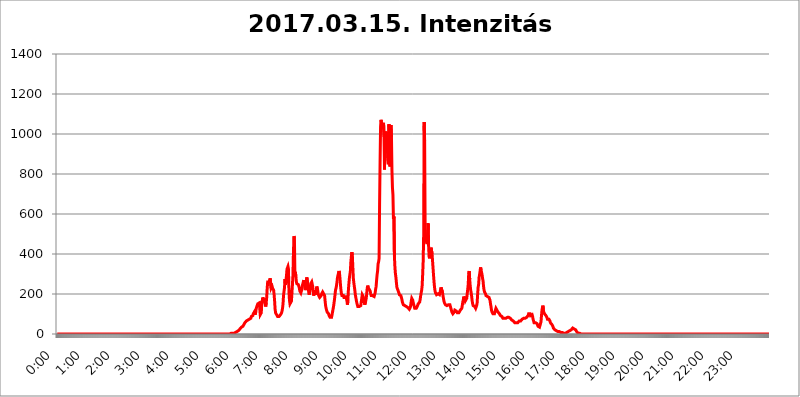
| Category | 2017.03.15. Intenzitás [W/m^2] |
|---|---|
| 0.0 | 0 |
| 0.0006944444444444445 | 0 |
| 0.001388888888888889 | 0 |
| 0.0020833333333333333 | 0 |
| 0.002777777777777778 | 0 |
| 0.003472222222222222 | 0 |
| 0.004166666666666667 | 0 |
| 0.004861111111111111 | 0 |
| 0.005555555555555556 | 0 |
| 0.0062499999999999995 | 0 |
| 0.006944444444444444 | 0 |
| 0.007638888888888889 | 0 |
| 0.008333333333333333 | 0 |
| 0.009027777777777779 | 0 |
| 0.009722222222222222 | 0 |
| 0.010416666666666666 | 0 |
| 0.011111111111111112 | 0 |
| 0.011805555555555555 | 0 |
| 0.012499999999999999 | 0 |
| 0.013194444444444444 | 0 |
| 0.013888888888888888 | 0 |
| 0.014583333333333332 | 0 |
| 0.015277777777777777 | 0 |
| 0.015972222222222224 | 0 |
| 0.016666666666666666 | 0 |
| 0.017361111111111112 | 0 |
| 0.018055555555555557 | 0 |
| 0.01875 | 0 |
| 0.019444444444444445 | 0 |
| 0.02013888888888889 | 0 |
| 0.020833333333333332 | 0 |
| 0.02152777777777778 | 0 |
| 0.022222222222222223 | 0 |
| 0.02291666666666667 | 0 |
| 0.02361111111111111 | 0 |
| 0.024305555555555556 | 0 |
| 0.024999999999999998 | 0 |
| 0.025694444444444447 | 0 |
| 0.02638888888888889 | 0 |
| 0.027083333333333334 | 0 |
| 0.027777777777777776 | 0 |
| 0.02847222222222222 | 0 |
| 0.029166666666666664 | 0 |
| 0.029861111111111113 | 0 |
| 0.030555555555555555 | 0 |
| 0.03125 | 0 |
| 0.03194444444444445 | 0 |
| 0.03263888888888889 | 0 |
| 0.03333333333333333 | 0 |
| 0.034027777777777775 | 0 |
| 0.034722222222222224 | 0 |
| 0.035416666666666666 | 0 |
| 0.036111111111111115 | 0 |
| 0.03680555555555556 | 0 |
| 0.0375 | 0 |
| 0.03819444444444444 | 0 |
| 0.03888888888888889 | 0 |
| 0.03958333333333333 | 0 |
| 0.04027777777777778 | 0 |
| 0.04097222222222222 | 0 |
| 0.041666666666666664 | 0 |
| 0.042361111111111106 | 0 |
| 0.04305555555555556 | 0 |
| 0.043750000000000004 | 0 |
| 0.044444444444444446 | 0 |
| 0.04513888888888889 | 0 |
| 0.04583333333333334 | 0 |
| 0.04652777777777778 | 0 |
| 0.04722222222222222 | 0 |
| 0.04791666666666666 | 0 |
| 0.04861111111111111 | 0 |
| 0.049305555555555554 | 0 |
| 0.049999999999999996 | 0 |
| 0.05069444444444445 | 0 |
| 0.051388888888888894 | 0 |
| 0.052083333333333336 | 0 |
| 0.05277777777777778 | 0 |
| 0.05347222222222222 | 0 |
| 0.05416666666666667 | 0 |
| 0.05486111111111111 | 0 |
| 0.05555555555555555 | 0 |
| 0.05625 | 0 |
| 0.05694444444444444 | 0 |
| 0.057638888888888885 | 0 |
| 0.05833333333333333 | 0 |
| 0.05902777777777778 | 0 |
| 0.059722222222222225 | 0 |
| 0.06041666666666667 | 0 |
| 0.061111111111111116 | 0 |
| 0.06180555555555556 | 0 |
| 0.0625 | 0 |
| 0.06319444444444444 | 0 |
| 0.06388888888888888 | 0 |
| 0.06458333333333334 | 0 |
| 0.06527777777777778 | 0 |
| 0.06597222222222222 | 0 |
| 0.06666666666666667 | 0 |
| 0.06736111111111111 | 0 |
| 0.06805555555555555 | 0 |
| 0.06874999999999999 | 0 |
| 0.06944444444444443 | 0 |
| 0.07013888888888889 | 0 |
| 0.07083333333333333 | 0 |
| 0.07152777777777779 | 0 |
| 0.07222222222222223 | 0 |
| 0.07291666666666667 | 0 |
| 0.07361111111111111 | 0 |
| 0.07430555555555556 | 0 |
| 0.075 | 0 |
| 0.07569444444444444 | 0 |
| 0.0763888888888889 | 0 |
| 0.07708333333333334 | 0 |
| 0.07777777777777778 | 0 |
| 0.07847222222222222 | 0 |
| 0.07916666666666666 | 0 |
| 0.0798611111111111 | 0 |
| 0.08055555555555556 | 0 |
| 0.08125 | 0 |
| 0.08194444444444444 | 0 |
| 0.08263888888888889 | 0 |
| 0.08333333333333333 | 0 |
| 0.08402777777777777 | 0 |
| 0.08472222222222221 | 0 |
| 0.08541666666666665 | 0 |
| 0.08611111111111112 | 0 |
| 0.08680555555555557 | 0 |
| 0.08750000000000001 | 0 |
| 0.08819444444444445 | 0 |
| 0.08888888888888889 | 0 |
| 0.08958333333333333 | 0 |
| 0.09027777777777778 | 0 |
| 0.09097222222222222 | 0 |
| 0.09166666666666667 | 0 |
| 0.09236111111111112 | 0 |
| 0.09305555555555556 | 0 |
| 0.09375 | 0 |
| 0.09444444444444444 | 0 |
| 0.09513888888888888 | 0 |
| 0.09583333333333333 | 0 |
| 0.09652777777777777 | 0 |
| 0.09722222222222222 | 0 |
| 0.09791666666666667 | 0 |
| 0.09861111111111111 | 0 |
| 0.09930555555555555 | 0 |
| 0.09999999999999999 | 0 |
| 0.10069444444444443 | 0 |
| 0.1013888888888889 | 0 |
| 0.10208333333333335 | 0 |
| 0.10277777777777779 | 0 |
| 0.10347222222222223 | 0 |
| 0.10416666666666667 | 0 |
| 0.10486111111111111 | 0 |
| 0.10555555555555556 | 0 |
| 0.10625 | 0 |
| 0.10694444444444444 | 0 |
| 0.1076388888888889 | 0 |
| 0.10833333333333334 | 0 |
| 0.10902777777777778 | 0 |
| 0.10972222222222222 | 0 |
| 0.1111111111111111 | 0 |
| 0.11180555555555556 | 0 |
| 0.11180555555555556 | 0 |
| 0.1125 | 0 |
| 0.11319444444444444 | 0 |
| 0.11388888888888889 | 0 |
| 0.11458333333333333 | 0 |
| 0.11527777777777777 | 0 |
| 0.11597222222222221 | 0 |
| 0.11666666666666665 | 0 |
| 0.1173611111111111 | 0 |
| 0.11805555555555557 | 0 |
| 0.11944444444444445 | 0 |
| 0.12013888888888889 | 0 |
| 0.12083333333333333 | 0 |
| 0.12152777777777778 | 0 |
| 0.12222222222222223 | 0 |
| 0.12291666666666667 | 0 |
| 0.12291666666666667 | 0 |
| 0.12361111111111112 | 0 |
| 0.12430555555555556 | 0 |
| 0.125 | 0 |
| 0.12569444444444444 | 0 |
| 0.12638888888888888 | 0 |
| 0.12708333333333333 | 0 |
| 0.16875 | 0 |
| 0.12847222222222224 | 0 |
| 0.12916666666666668 | 0 |
| 0.12986111111111112 | 0 |
| 0.13055555555555556 | 0 |
| 0.13125 | 0 |
| 0.13194444444444445 | 0 |
| 0.1326388888888889 | 0 |
| 0.13333333333333333 | 0 |
| 0.13402777777777777 | 0 |
| 0.13402777777777777 | 0 |
| 0.13472222222222222 | 0 |
| 0.13541666666666666 | 0 |
| 0.1361111111111111 | 0 |
| 0.13749999999999998 | 0 |
| 0.13819444444444443 | 0 |
| 0.1388888888888889 | 0 |
| 0.13958333333333334 | 0 |
| 0.14027777777777778 | 0 |
| 0.14097222222222222 | 0 |
| 0.14166666666666666 | 0 |
| 0.1423611111111111 | 0 |
| 0.14305555555555557 | 0 |
| 0.14375000000000002 | 0 |
| 0.14444444444444446 | 0 |
| 0.1451388888888889 | 0 |
| 0.1451388888888889 | 0 |
| 0.14652777777777778 | 0 |
| 0.14722222222222223 | 0 |
| 0.14791666666666667 | 0 |
| 0.1486111111111111 | 0 |
| 0.14930555555555555 | 0 |
| 0.15 | 0 |
| 0.15069444444444444 | 0 |
| 0.15138888888888888 | 0 |
| 0.15208333333333332 | 0 |
| 0.15277777777777776 | 0 |
| 0.15347222222222223 | 0 |
| 0.15416666666666667 | 0 |
| 0.15486111111111112 | 0 |
| 0.15555555555555556 | 0 |
| 0.15625 | 0 |
| 0.15694444444444444 | 0 |
| 0.15763888888888888 | 0 |
| 0.15833333333333333 | 0 |
| 0.15902777777777777 | 0 |
| 0.15972222222222224 | 0 |
| 0.16041666666666668 | 0 |
| 0.16111111111111112 | 0 |
| 0.16180555555555556 | 0 |
| 0.1625 | 0 |
| 0.16319444444444445 | 0 |
| 0.1638888888888889 | 0 |
| 0.16458333333333333 | 0 |
| 0.16527777777777777 | 0 |
| 0.16597222222222222 | 0 |
| 0.16666666666666666 | 0 |
| 0.1673611111111111 | 0 |
| 0.16805555555555554 | 0 |
| 0.16874999999999998 | 0 |
| 0.16944444444444443 | 0 |
| 0.17013888888888887 | 0 |
| 0.1708333333333333 | 0 |
| 0.17152777777777775 | 0 |
| 0.17222222222222225 | 0 |
| 0.1729166666666667 | 0 |
| 0.17361111111111113 | 0 |
| 0.17430555555555557 | 0 |
| 0.17500000000000002 | 0 |
| 0.17569444444444446 | 0 |
| 0.1763888888888889 | 0 |
| 0.17708333333333334 | 0 |
| 0.17777777777777778 | 0 |
| 0.17847222222222223 | 0 |
| 0.17916666666666667 | 0 |
| 0.1798611111111111 | 0 |
| 0.18055555555555555 | 0 |
| 0.18125 | 0 |
| 0.18194444444444444 | 0 |
| 0.1826388888888889 | 0 |
| 0.18333333333333335 | 0 |
| 0.1840277777777778 | 0 |
| 0.18472222222222223 | 0 |
| 0.18541666666666667 | 0 |
| 0.18611111111111112 | 0 |
| 0.18680555555555556 | 0 |
| 0.1875 | 0 |
| 0.18819444444444444 | 0 |
| 0.18888888888888888 | 0 |
| 0.18958333333333333 | 0 |
| 0.19027777777777777 | 0 |
| 0.1909722222222222 | 0 |
| 0.19166666666666665 | 0 |
| 0.19236111111111112 | 0 |
| 0.19305555555555554 | 0 |
| 0.19375 | 0 |
| 0.19444444444444445 | 0 |
| 0.1951388888888889 | 0 |
| 0.19583333333333333 | 0 |
| 0.19652777777777777 | 0 |
| 0.19722222222222222 | 0 |
| 0.19791666666666666 | 0 |
| 0.1986111111111111 | 0 |
| 0.19930555555555554 | 0 |
| 0.19999999999999998 | 0 |
| 0.20069444444444443 | 0 |
| 0.20138888888888887 | 0 |
| 0.2020833333333333 | 0 |
| 0.2027777777777778 | 0 |
| 0.2034722222222222 | 0 |
| 0.2041666666666667 | 0 |
| 0.20486111111111113 | 0 |
| 0.20555555555555557 | 0 |
| 0.20625000000000002 | 0 |
| 0.20694444444444446 | 0 |
| 0.2076388888888889 | 0 |
| 0.20833333333333334 | 0 |
| 0.20902777777777778 | 0 |
| 0.20972222222222223 | 0 |
| 0.21041666666666667 | 0 |
| 0.2111111111111111 | 0 |
| 0.21180555555555555 | 0 |
| 0.2125 | 0 |
| 0.21319444444444444 | 0 |
| 0.2138888888888889 | 0 |
| 0.21458333333333335 | 0 |
| 0.2152777777777778 | 0 |
| 0.21597222222222223 | 0 |
| 0.21666666666666667 | 0 |
| 0.21736111111111112 | 0 |
| 0.21805555555555556 | 0 |
| 0.21875 | 0 |
| 0.21944444444444444 | 0 |
| 0.22013888888888888 | 0 |
| 0.22083333333333333 | 0 |
| 0.22152777777777777 | 0 |
| 0.2222222222222222 | 0 |
| 0.22291666666666665 | 0 |
| 0.2236111111111111 | 0 |
| 0.22430555555555556 | 0 |
| 0.225 | 0 |
| 0.22569444444444445 | 0 |
| 0.2263888888888889 | 0 |
| 0.22708333333333333 | 0 |
| 0.22777777777777777 | 0 |
| 0.22847222222222222 | 0 |
| 0.22916666666666666 | 0 |
| 0.2298611111111111 | 0 |
| 0.23055555555555554 | 0 |
| 0.23124999999999998 | 0 |
| 0.23194444444444443 | 0 |
| 0.23263888888888887 | 0 |
| 0.2333333333333333 | 0 |
| 0.2340277777777778 | 0 |
| 0.2347222222222222 | 0 |
| 0.2354166666666667 | 0 |
| 0.23611111111111113 | 0 |
| 0.23680555555555557 | 0 |
| 0.23750000000000002 | 0 |
| 0.23819444444444446 | 0 |
| 0.2388888888888889 | 0 |
| 0.23958333333333334 | 0 |
| 0.24027777777777778 | 0 |
| 0.24097222222222223 | 0 |
| 0.24166666666666667 | 0 |
| 0.2423611111111111 | 3.525 |
| 0.24305555555555555 | 3.525 |
| 0.24375 | 3.525 |
| 0.24444444444444446 | 3.525 |
| 0.24513888888888888 | 3.525 |
| 0.24583333333333335 | 3.525 |
| 0.2465277777777778 | 3.525 |
| 0.24722222222222223 | 3.525 |
| 0.24791666666666667 | 3.525 |
| 0.24861111111111112 | 7.887 |
| 0.24930555555555556 | 7.887 |
| 0.25 | 7.887 |
| 0.25069444444444444 | 7.887 |
| 0.2513888888888889 | 12.257 |
| 0.2520833333333333 | 12.257 |
| 0.25277777777777777 | 12.257 |
| 0.2534722222222222 | 16.636 |
| 0.25416666666666665 | 16.636 |
| 0.2548611111111111 | 16.636 |
| 0.2555555555555556 | 21.024 |
| 0.25625000000000003 | 25.419 |
| 0.2569444444444445 | 29.823 |
| 0.2576388888888889 | 29.823 |
| 0.25833333333333336 | 34.234 |
| 0.2590277777777778 | 34.234 |
| 0.25972222222222224 | 38.653 |
| 0.2604166666666667 | 38.653 |
| 0.2611111111111111 | 43.079 |
| 0.26180555555555557 | 47.511 |
| 0.2625 | 51.951 |
| 0.26319444444444445 | 56.398 |
| 0.2638888888888889 | 56.398 |
| 0.26458333333333334 | 60.85 |
| 0.2652777777777778 | 65.31 |
| 0.2659722222222222 | 65.31 |
| 0.26666666666666666 | 69.775 |
| 0.2673611111111111 | 69.775 |
| 0.26805555555555555 | 74.246 |
| 0.26875 | 74.246 |
| 0.26944444444444443 | 74.246 |
| 0.2701388888888889 | 69.775 |
| 0.2708333333333333 | 69.775 |
| 0.27152777777777776 | 78.722 |
| 0.2722222222222222 | 87.692 |
| 0.27291666666666664 | 92.184 |
| 0.2736111111111111 | 92.184 |
| 0.2743055555555555 | 92.184 |
| 0.27499999999999997 | 101.184 |
| 0.27569444444444446 | 101.184 |
| 0.27638888888888885 | 110.201 |
| 0.27708333333333335 | 110.201 |
| 0.2777777777777778 | 96.682 |
| 0.27847222222222223 | 114.716 |
| 0.2791666666666667 | 128.284 |
| 0.2798611111111111 | 137.347 |
| 0.28055555555555556 | 141.884 |
| 0.28125 | 150.964 |
| 0.28194444444444444 | 155.509 |
| 0.2826388888888889 | 155.509 |
| 0.2833333333333333 | 155.509 |
| 0.28402777777777777 | 150.964 |
| 0.2847222222222222 | 96.682 |
| 0.28541666666666665 | 92.184 |
| 0.28611111111111115 | 105.69 |
| 0.28680555555555554 | 146.423 |
| 0.28750000000000003 | 160.056 |
| 0.2881944444444445 | 182.82 |
| 0.2888888888888889 | 182.82 |
| 0.28958333333333336 | 187.378 |
| 0.2902777777777778 | 164.605 |
| 0.29097222222222224 | 160.056 |
| 0.2916666666666667 | 150.964 |
| 0.2923611111111111 | 137.347 |
| 0.29305555555555557 | 155.509 |
| 0.29375 | 182.82 |
| 0.29444444444444445 | 228.436 |
| 0.2951388888888889 | 260.373 |
| 0.29583333333333334 | 260.373 |
| 0.2965277777777778 | 264.932 |
| 0.2972222222222222 | 260.373 |
| 0.29791666666666666 | 269.49 |
| 0.2986111111111111 | 278.603 |
| 0.29930555555555555 | 278.603 |
| 0.3 | 228.436 |
| 0.30069444444444443 | 228.436 |
| 0.3013888888888889 | 237.564 |
| 0.3020833333333333 | 228.436 |
| 0.30277777777777776 | 233 |
| 0.3034722222222222 | 219.309 |
| 0.30416666666666664 | 196.497 |
| 0.3048611111111111 | 164.605 |
| 0.3055555555555555 | 123.758 |
| 0.30624999999999997 | 105.69 |
| 0.3069444444444444 | 101.184 |
| 0.3076388888888889 | 96.682 |
| 0.30833333333333335 | 92.184 |
| 0.3090277777777778 | 87.692 |
| 0.30972222222222223 | 87.692 |
| 0.3104166666666667 | 87.692 |
| 0.3111111111111111 | 87.692 |
| 0.31180555555555556 | 92.184 |
| 0.3125 | 92.184 |
| 0.31319444444444444 | 96.682 |
| 0.3138888888888889 | 101.184 |
| 0.3145833333333333 | 105.69 |
| 0.31527777777777777 | 114.716 |
| 0.3159722222222222 | 128.284 |
| 0.31666666666666665 | 150.964 |
| 0.31736111111111115 | 191.937 |
| 0.31805555555555554 | 196.497 |
| 0.31875000000000003 | 233 |
| 0.3194444444444445 | 274.047 |
| 0.3201388888888889 | 246.689 |
| 0.32083333333333336 | 269.49 |
| 0.3215277777777778 | 292.259 |
| 0.32222222222222224 | 324.052 |
| 0.3229166666666667 | 319.517 |
| 0.3236111111111111 | 337.639 |
| 0.32430555555555557 | 324.052 |
| 0.325 | 210.182 |
| 0.32569444444444445 | 169.156 |
| 0.3263888888888889 | 150.964 |
| 0.32708333333333334 | 146.423 |
| 0.3277777777777778 | 146.423 |
| 0.3284722222222222 | 164.605 |
| 0.32916666666666666 | 205.62 |
| 0.3298611111111111 | 246.689 |
| 0.33055555555555555 | 292.259 |
| 0.33125 | 400.638 |
| 0.33194444444444443 | 489.108 |
| 0.3326388888888889 | 480.356 |
| 0.3333333333333333 | 292.259 |
| 0.3340277777777778 | 310.44 |
| 0.3347222222222222 | 283.156 |
| 0.3354166666666667 | 260.373 |
| 0.3361111111111111 | 251.251 |
| 0.3368055555555556 | 246.689 |
| 0.33749999999999997 | 251.251 |
| 0.33819444444444446 | 246.689 |
| 0.33888888888888885 | 242.127 |
| 0.33958333333333335 | 228.436 |
| 0.34027777777777773 | 214.746 |
| 0.34097222222222223 | 210.182 |
| 0.3416666666666666 | 205.62 |
| 0.3423611111111111 | 210.182 |
| 0.3430555555555555 | 223.873 |
| 0.34375 | 242.127 |
| 0.3444444444444445 | 251.251 |
| 0.3451388888888889 | 260.373 |
| 0.3458333333333334 | 269.49 |
| 0.34652777777777777 | 251.251 |
| 0.34722222222222227 | 233 |
| 0.34791666666666665 | 219.309 |
| 0.34861111111111115 | 233 |
| 0.34930555555555554 | 260.373 |
| 0.35000000000000003 | 283.156 |
| 0.3506944444444444 | 283.156 |
| 0.3513888888888889 | 251.251 |
| 0.3520833333333333 | 228.436 |
| 0.3527777777777778 | 205.62 |
| 0.3534722222222222 | 196.497 |
| 0.3541666666666667 | 214.746 |
| 0.3548611111111111 | 233 |
| 0.35555555555555557 | 251.251 |
| 0.35625 | 251.251 |
| 0.35694444444444445 | 260.373 |
| 0.3576388888888889 | 255.813 |
| 0.35833333333333334 | 237.564 |
| 0.3590277777777778 | 210.182 |
| 0.3597222222222222 | 191.937 |
| 0.36041666666666666 | 205.62 |
| 0.3611111111111111 | 219.309 |
| 0.36180555555555555 | 205.62 |
| 0.3625 | 196.497 |
| 0.36319444444444443 | 210.182 |
| 0.3638888888888889 | 237.564 |
| 0.3645833333333333 | 242.127 |
| 0.3652777777777778 | 219.309 |
| 0.3659722222222222 | 201.058 |
| 0.3666666666666667 | 191.937 |
| 0.3673611111111111 | 187.378 |
| 0.3680555555555556 | 182.82 |
| 0.36874999999999997 | 182.82 |
| 0.36944444444444446 | 187.378 |
| 0.37013888888888885 | 191.937 |
| 0.37083333333333335 | 201.058 |
| 0.37152777777777773 | 205.62 |
| 0.37222222222222223 | 210.182 |
| 0.3729166666666666 | 205.62 |
| 0.3736111111111111 | 201.058 |
| 0.3743055555555555 | 201.058 |
| 0.375 | 191.937 |
| 0.3756944444444445 | 164.605 |
| 0.3763888888888889 | 141.884 |
| 0.3770833333333334 | 128.284 |
| 0.37777777777777777 | 119.235 |
| 0.37847222222222227 | 110.201 |
| 0.37916666666666665 | 105.69 |
| 0.37986111111111115 | 105.69 |
| 0.38055555555555554 | 101.184 |
| 0.38125000000000003 | 92.184 |
| 0.3819444444444444 | 87.692 |
| 0.3826388888888889 | 83.205 |
| 0.3833333333333333 | 83.205 |
| 0.3840277777777778 | 83.205 |
| 0.3847222222222222 | 83.205 |
| 0.3854166666666667 | 96.682 |
| 0.3861111111111111 | 110.201 |
| 0.38680555555555557 | 123.758 |
| 0.3875 | 137.347 |
| 0.38819444444444445 | 155.509 |
| 0.3888888888888889 | 173.709 |
| 0.38958333333333334 | 196.497 |
| 0.3902777777777778 | 219.309 |
| 0.3909722222222222 | 228.436 |
| 0.39166666666666666 | 242.127 |
| 0.3923611111111111 | 260.373 |
| 0.39305555555555555 | 283.156 |
| 0.39375 | 278.603 |
| 0.39444444444444443 | 287.709 |
| 0.3951388888888889 | 314.98 |
| 0.3958333333333333 | 305.898 |
| 0.3965277777777778 | 278.603 |
| 0.3972222222222222 | 246.689 |
| 0.3979166666666667 | 219.309 |
| 0.3986111111111111 | 201.058 |
| 0.3993055555555556 | 191.937 |
| 0.39999999999999997 | 191.937 |
| 0.40069444444444446 | 191.937 |
| 0.40138888888888885 | 191.937 |
| 0.40208333333333335 | 182.82 |
| 0.40277777777777773 | 182.82 |
| 0.40347222222222223 | 182.82 |
| 0.4041666666666666 | 182.82 |
| 0.4048611111111111 | 191.937 |
| 0.4055555555555555 | 191.937 |
| 0.40625 | 169.156 |
| 0.4069444444444445 | 146.423 |
| 0.4076388888888889 | 164.605 |
| 0.4083333333333334 | 219.309 |
| 0.40902777777777777 | 251.251 |
| 0.40972222222222227 | 278.603 |
| 0.41041666666666665 | 296.808 |
| 0.41111111111111115 | 314.98 |
| 0.41180555555555554 | 360.221 |
| 0.41250000000000003 | 387.202 |
| 0.4131944444444444 | 409.574 |
| 0.4138888888888889 | 391.685 |
| 0.4145833333333333 | 333.113 |
| 0.4152777777777778 | 278.603 |
| 0.4159722222222222 | 255.813 |
| 0.4166666666666667 | 237.564 |
| 0.4173611111111111 | 219.309 |
| 0.41805555555555557 | 196.497 |
| 0.41875 | 182.82 |
| 0.41944444444444445 | 169.156 |
| 0.4201388888888889 | 155.509 |
| 0.42083333333333334 | 146.423 |
| 0.4215277777777778 | 137.347 |
| 0.4222222222222222 | 132.814 |
| 0.42291666666666666 | 137.347 |
| 0.4236111111111111 | 137.347 |
| 0.42430555555555555 | 132.814 |
| 0.425 | 141.884 |
| 0.42569444444444443 | 141.884 |
| 0.4263888888888889 | 146.423 |
| 0.4270833333333333 | 178.264 |
| 0.4277777777777778 | 196.497 |
| 0.4284722222222222 | 196.497 |
| 0.4291666666666667 | 187.378 |
| 0.4298611111111111 | 173.709 |
| 0.4305555555555556 | 160.056 |
| 0.43124999999999997 | 146.423 |
| 0.43194444444444446 | 150.964 |
| 0.43263888888888885 | 164.605 |
| 0.43333333333333335 | 178.264 |
| 0.43402777777777773 | 201.058 |
| 0.43472222222222223 | 228.436 |
| 0.4354166666666666 | 242.127 |
| 0.4361111111111111 | 233 |
| 0.4368055555555555 | 228.436 |
| 0.4375 | 223.873 |
| 0.4381944444444445 | 219.309 |
| 0.4388888888888889 | 214.746 |
| 0.4395833333333334 | 201.058 |
| 0.44027777777777777 | 191.937 |
| 0.44097222222222227 | 187.378 |
| 0.44166666666666665 | 187.378 |
| 0.44236111111111115 | 191.937 |
| 0.44305555555555554 | 191.937 |
| 0.44375000000000003 | 191.937 |
| 0.4444444444444444 | 187.378 |
| 0.4451388888888889 | 187.378 |
| 0.4458333333333333 | 205.62 |
| 0.4465277777777778 | 223.873 |
| 0.4472222222222222 | 237.564 |
| 0.4479166666666667 | 269.49 |
| 0.4486111111111111 | 296.808 |
| 0.44930555555555557 | 314.98 |
| 0.45 | 351.198 |
| 0.45069444444444445 | 360.221 |
| 0.4513888888888889 | 378.224 |
| 0.45208333333333334 | 646.537 |
| 0.4527777777777778 | 856.855 |
| 0.4534722222222222 | 1037.277 |
| 0.45416666666666666 | 1071.027 |
| 0.4548611111111111 | 1052.255 |
| 0.45555555555555555 | 1052.255 |
| 0.45625 | 1041.019 |
| 0.45694444444444443 | 1048.508 |
| 0.4576388888888889 | 1056.004 |
| 0.4583333333333333 | 984.98 |
| 0.4590277777777778 | 822.26 |
| 0.4597222222222222 | 955.071 |
| 0.4604166666666667 | 1011.118 |
| 0.4611111111111111 | 999.916 |
| 0.4618055555555556 | 1011.118 |
| 0.46249999999999997 | 1014.852 |
| 0.46319444444444446 | 1014.852 |
| 0.46388888888888885 | 868.305 |
| 0.46458333333333335 | 849.199 |
| 0.46527777777777773 | 1048.508 |
| 0.46597222222222223 | 1003.65 |
| 0.4666666666666666 | 837.682 |
| 0.4673611111111111 | 970.034 |
| 0.4680555555555555 | 1044.762 |
| 0.46875 | 984.98 |
| 0.4694444444444445 | 814.519 |
| 0.4701388888888889 | 731.896 |
| 0.4708333333333334 | 695.666 |
| 0.47152777777777777 | 575.299 |
| 0.47222222222222227 | 588.009 |
| 0.47291666666666665 | 387.202 |
| 0.47361111111111115 | 333.113 |
| 0.47430555555555554 | 301.354 |
| 0.47500000000000003 | 283.156 |
| 0.4756944444444444 | 255.813 |
| 0.4763888888888889 | 233 |
| 0.4770833333333333 | 228.436 |
| 0.4777777777777778 | 219.309 |
| 0.4784722222222222 | 214.746 |
| 0.4791666666666667 | 205.62 |
| 0.4798611111111111 | 196.497 |
| 0.48055555555555557 | 191.937 |
| 0.48125 | 191.937 |
| 0.48194444444444445 | 191.937 |
| 0.4826388888888889 | 182.82 |
| 0.48333333333333334 | 173.709 |
| 0.4840277777777778 | 160.056 |
| 0.4847222222222222 | 155.509 |
| 0.48541666666666666 | 146.423 |
| 0.4861111111111111 | 141.884 |
| 0.48680555555555555 | 141.884 |
| 0.4875 | 141.884 |
| 0.48819444444444443 | 146.423 |
| 0.4888888888888889 | 146.423 |
| 0.4895833333333333 | 137.347 |
| 0.4902777777777778 | 137.347 |
| 0.4909722222222222 | 137.347 |
| 0.4916666666666667 | 132.814 |
| 0.4923611111111111 | 128.284 |
| 0.4930555555555556 | 128.284 |
| 0.49374999999999997 | 123.758 |
| 0.49444444444444446 | 128.284 |
| 0.49513888888888885 | 132.814 |
| 0.49583333333333335 | 146.423 |
| 0.49652777777777773 | 164.605 |
| 0.49722222222222223 | 178.264 |
| 0.4979166666666666 | 178.264 |
| 0.4986111111111111 | 169.156 |
| 0.4993055555555555 | 155.509 |
| 0.5 | 146.423 |
| 0.5006944444444444 | 141.884 |
| 0.5013888888888889 | 128.284 |
| 0.5020833333333333 | 123.758 |
| 0.5027777777777778 | 123.758 |
| 0.5034722222222222 | 128.284 |
| 0.5041666666666667 | 132.814 |
| 0.5048611111111111 | 137.347 |
| 0.5055555555555555 | 141.884 |
| 0.50625 | 150.964 |
| 0.5069444444444444 | 150.964 |
| 0.5076388888888889 | 155.509 |
| 0.5083333333333333 | 160.056 |
| 0.5090277777777777 | 173.709 |
| 0.5097222222222222 | 191.937 |
| 0.5104166666666666 | 205.62 |
| 0.5111111111111112 | 219.309 |
| 0.5118055555555555 | 242.127 |
| 0.5125000000000001 | 296.808 |
| 0.5131944444444444 | 360.221 |
| 0.513888888888889 | 489.108 |
| 0.5145833333333333 | 1059.756 |
| 0.5152777777777778 | 966.295 |
| 0.5159722222222222 | 532.513 |
| 0.5166666666666667 | 484.735 |
| 0.517361111111111 | 467.187 |
| 0.5180555555555556 | 458.38 |
| 0.5187499999999999 | 449.551 |
| 0.5194444444444445 | 480.356 |
| 0.5201388888888888 | 553.986 |
| 0.5208333333333334 | 440.702 |
| 0.5215277777777778 | 387.202 |
| 0.5222222222222223 | 378.224 |
| 0.5229166666666667 | 391.685 |
| 0.5236111111111111 | 414.035 |
| 0.5243055555555556 | 431.833 |
| 0.525 | 431.833 |
| 0.5256944444444445 | 400.638 |
| 0.5263888888888889 | 364.728 |
| 0.5270833333333333 | 328.584 |
| 0.5277777777777778 | 292.259 |
| 0.5284722222222222 | 260.373 |
| 0.5291666666666667 | 233 |
| 0.5298611111111111 | 214.746 |
| 0.5305555555555556 | 205.62 |
| 0.53125 | 201.058 |
| 0.5319444444444444 | 196.497 |
| 0.5326388888888889 | 191.937 |
| 0.5333333333333333 | 191.937 |
| 0.5340277777777778 | 201.058 |
| 0.5347222222222222 | 201.058 |
| 0.5354166666666667 | 201.058 |
| 0.5361111111111111 | 196.497 |
| 0.5368055555555555 | 205.62 |
| 0.5375 | 219.309 |
| 0.5381944444444444 | 233 |
| 0.5388888888888889 | 237.564 |
| 0.5395833333333333 | 228.436 |
| 0.5402777777777777 | 210.182 |
| 0.5409722222222222 | 191.937 |
| 0.5416666666666666 | 178.264 |
| 0.5423611111111112 | 164.605 |
| 0.5430555555555555 | 155.509 |
| 0.5437500000000001 | 150.964 |
| 0.5444444444444444 | 146.423 |
| 0.545138888888889 | 141.884 |
| 0.5458333333333333 | 141.884 |
| 0.5465277777777778 | 141.884 |
| 0.5472222222222222 | 141.884 |
| 0.5479166666666667 | 141.884 |
| 0.548611111111111 | 146.423 |
| 0.5493055555555556 | 150.964 |
| 0.5499999999999999 | 146.423 |
| 0.5506944444444445 | 146.423 |
| 0.5513888888888888 | 137.347 |
| 0.5520833333333334 | 128.284 |
| 0.5527777777777778 | 119.235 |
| 0.5534722222222223 | 110.201 |
| 0.5541666666666667 | 105.69 |
| 0.5548611111111111 | 101.184 |
| 0.5555555555555556 | 101.184 |
| 0.55625 | 105.69 |
| 0.5569444444444445 | 110.201 |
| 0.5576388888888889 | 119.235 |
| 0.5583333333333333 | 123.758 |
| 0.5590277777777778 | 119.235 |
| 0.5597222222222222 | 114.716 |
| 0.5604166666666667 | 110.201 |
| 0.5611111111111111 | 105.69 |
| 0.5618055555555556 | 105.69 |
| 0.5625 | 105.69 |
| 0.5631944444444444 | 105.69 |
| 0.5638888888888889 | 105.69 |
| 0.5645833333333333 | 110.201 |
| 0.5652777777777778 | 119.235 |
| 0.5659722222222222 | 123.758 |
| 0.5666666666666667 | 123.758 |
| 0.5673611111111111 | 128.284 |
| 0.5680555555555555 | 141.884 |
| 0.56875 | 160.056 |
| 0.5694444444444444 | 169.156 |
| 0.5701388888888889 | 187.378 |
| 0.5708333333333333 | 187.378 |
| 0.5715277777777777 | 173.709 |
| 0.5722222222222222 | 164.605 |
| 0.5729166666666666 | 160.056 |
| 0.5736111111111112 | 164.605 |
| 0.5743055555555555 | 178.264 |
| 0.5750000000000001 | 201.058 |
| 0.5756944444444444 | 223.873 |
| 0.576388888888889 | 246.689 |
| 0.5770833333333333 | 301.354 |
| 0.5777777777777778 | 314.98 |
| 0.5784722222222222 | 274.047 |
| 0.5791666666666667 | 242.127 |
| 0.579861111111111 | 219.309 |
| 0.5805555555555556 | 205.62 |
| 0.5812499999999999 | 187.378 |
| 0.5819444444444445 | 164.605 |
| 0.5826388888888888 | 150.964 |
| 0.5833333333333334 | 141.884 |
| 0.5840277777777778 | 141.884 |
| 0.5847222222222223 | 137.347 |
| 0.5854166666666667 | 137.347 |
| 0.5861111111111111 | 132.814 |
| 0.5868055555555556 | 128.284 |
| 0.5875 | 132.814 |
| 0.5881944444444445 | 141.884 |
| 0.5888888888888889 | 155.509 |
| 0.5895833333333333 | 196.497 |
| 0.5902777777777778 | 233 |
| 0.5909722222222222 | 246.689 |
| 0.5916666666666667 | 283.156 |
| 0.5923611111111111 | 296.808 |
| 0.5930555555555556 | 314.98 |
| 0.59375 | 333.113 |
| 0.5944444444444444 | 319.517 |
| 0.5951388888888889 | 319.517 |
| 0.5958333333333333 | 296.808 |
| 0.5965277777777778 | 278.603 |
| 0.5972222222222222 | 264.932 |
| 0.5979166666666667 | 237.564 |
| 0.5986111111111111 | 219.309 |
| 0.5993055555555555 | 210.182 |
| 0.6 | 205.62 |
| 0.6006944444444444 | 201.058 |
| 0.6013888888888889 | 191.937 |
| 0.6020833333333333 | 187.378 |
| 0.6027777777777777 | 191.937 |
| 0.6034722222222222 | 187.378 |
| 0.6041666666666666 | 187.378 |
| 0.6048611111111112 | 187.378 |
| 0.6055555555555555 | 182.82 |
| 0.6062500000000001 | 178.264 |
| 0.6069444444444444 | 169.156 |
| 0.607638888888889 | 150.964 |
| 0.6083333333333333 | 137.347 |
| 0.6090277777777778 | 119.235 |
| 0.6097222222222222 | 110.201 |
| 0.6104166666666667 | 105.69 |
| 0.611111111111111 | 101.184 |
| 0.6118055555555556 | 101.184 |
| 0.6124999999999999 | 101.184 |
| 0.6131944444444445 | 101.184 |
| 0.6138888888888888 | 110.201 |
| 0.6145833333333334 | 119.235 |
| 0.6152777777777778 | 128.284 |
| 0.6159722222222223 | 128.284 |
| 0.6166666666666667 | 119.235 |
| 0.6173611111111111 | 114.716 |
| 0.6180555555555556 | 110.201 |
| 0.61875 | 110.201 |
| 0.6194444444444445 | 105.69 |
| 0.6201388888888889 | 101.184 |
| 0.6208333333333333 | 96.682 |
| 0.6215277777777778 | 92.184 |
| 0.6222222222222222 | 92.184 |
| 0.6229166666666667 | 92.184 |
| 0.6236111111111111 | 87.692 |
| 0.6243055555555556 | 83.205 |
| 0.625 | 78.722 |
| 0.6256944444444444 | 78.722 |
| 0.6263888888888889 | 78.722 |
| 0.6270833333333333 | 78.722 |
| 0.6277777777777778 | 78.722 |
| 0.6284722222222222 | 78.722 |
| 0.6291666666666667 | 78.722 |
| 0.6298611111111111 | 83.205 |
| 0.6305555555555555 | 83.205 |
| 0.63125 | 83.205 |
| 0.6319444444444444 | 83.205 |
| 0.6326388888888889 | 83.205 |
| 0.6333333333333333 | 83.205 |
| 0.6340277777777777 | 83.205 |
| 0.6347222222222222 | 83.205 |
| 0.6354166666666666 | 78.722 |
| 0.6361111111111112 | 74.246 |
| 0.6368055555555555 | 74.246 |
| 0.6375000000000001 | 69.775 |
| 0.6381944444444444 | 65.31 |
| 0.638888888888889 | 65.31 |
| 0.6395833333333333 | 65.31 |
| 0.6402777777777778 | 60.85 |
| 0.6409722222222222 | 60.85 |
| 0.6416666666666667 | 56.398 |
| 0.642361111111111 | 56.398 |
| 0.6430555555555556 | 56.398 |
| 0.6437499999999999 | 56.398 |
| 0.6444444444444445 | 56.398 |
| 0.6451388888888888 | 56.398 |
| 0.6458333333333334 | 56.398 |
| 0.6465277777777778 | 60.85 |
| 0.6472222222222223 | 60.85 |
| 0.6479166666666667 | 65.31 |
| 0.6486111111111111 | 65.31 |
| 0.6493055555555556 | 65.31 |
| 0.65 | 65.31 |
| 0.6506944444444445 | 69.775 |
| 0.6513888888888889 | 69.775 |
| 0.6520833333333333 | 74.246 |
| 0.6527777777777778 | 74.246 |
| 0.6534722222222222 | 78.722 |
| 0.6541666666666667 | 78.722 |
| 0.6548611111111111 | 78.722 |
| 0.6555555555555556 | 78.722 |
| 0.65625 | 78.722 |
| 0.6569444444444444 | 78.722 |
| 0.6576388888888889 | 78.722 |
| 0.6583333333333333 | 83.205 |
| 0.6590277777777778 | 83.205 |
| 0.6597222222222222 | 87.692 |
| 0.6604166666666667 | 92.184 |
| 0.6611111111111111 | 101.184 |
| 0.6618055555555555 | 105.69 |
| 0.6625 | 105.69 |
| 0.6631944444444444 | 101.184 |
| 0.6638888888888889 | 92.184 |
| 0.6645833333333333 | 87.692 |
| 0.6652777777777777 | 92.184 |
| 0.6659722222222222 | 96.682 |
| 0.6666666666666666 | 87.692 |
| 0.6673611111111111 | 74.246 |
| 0.6680555555555556 | 65.31 |
| 0.6687500000000001 | 56.398 |
| 0.6694444444444444 | 51.951 |
| 0.6701388888888888 | 51.951 |
| 0.6708333333333334 | 56.398 |
| 0.6715277777777778 | 56.398 |
| 0.6722222222222222 | 56.398 |
| 0.6729166666666666 | 51.951 |
| 0.6736111111111112 | 47.511 |
| 0.6743055555555556 | 38.653 |
| 0.6749999999999999 | 38.653 |
| 0.6756944444444444 | 38.653 |
| 0.6763888888888889 | 34.234 |
| 0.6770833333333334 | 34.234 |
| 0.6777777777777777 | 38.653 |
| 0.6784722222222223 | 60.85 |
| 0.6791666666666667 | 92.184 |
| 0.6798611111111111 | 119.235 |
| 0.6805555555555555 | 132.814 |
| 0.68125 | 141.884 |
| 0.6819444444444445 | 114.716 |
| 0.6826388888888889 | 114.716 |
| 0.6833333333333332 | 101.184 |
| 0.6840277777777778 | 101.184 |
| 0.6847222222222222 | 96.682 |
| 0.6854166666666667 | 92.184 |
| 0.686111111111111 | 92.184 |
| 0.6868055555555556 | 83.205 |
| 0.6875 | 74.246 |
| 0.6881944444444444 | 74.246 |
| 0.688888888888889 | 74.246 |
| 0.6895833333333333 | 74.246 |
| 0.6902777777777778 | 69.775 |
| 0.6909722222222222 | 65.31 |
| 0.6916666666666668 | 56.398 |
| 0.6923611111111111 | 56.398 |
| 0.6930555555555555 | 51.951 |
| 0.69375 | 47.511 |
| 0.6944444444444445 | 43.079 |
| 0.6951388888888889 | 38.653 |
| 0.6958333333333333 | 29.823 |
| 0.6965277777777777 | 29.823 |
| 0.6972222222222223 | 25.419 |
| 0.6979166666666666 | 21.024 |
| 0.6986111111111111 | 21.024 |
| 0.6993055555555556 | 21.024 |
| 0.7000000000000001 | 16.636 |
| 0.7006944444444444 | 16.636 |
| 0.7013888888888888 | 16.636 |
| 0.7020833333333334 | 12.257 |
| 0.7027777777777778 | 12.257 |
| 0.7034722222222222 | 12.257 |
| 0.7041666666666666 | 12.257 |
| 0.7048611111111112 | 12.257 |
| 0.7055555555555556 | 7.887 |
| 0.7062499999999999 | 7.887 |
| 0.7069444444444444 | 7.887 |
| 0.7076388888888889 | 7.887 |
| 0.7083333333333334 | 7.887 |
| 0.7090277777777777 | 3.525 |
| 0.7097222222222223 | 3.525 |
| 0.7104166666666667 | 3.525 |
| 0.7111111111111111 | 3.525 |
| 0.7118055555555555 | 3.525 |
| 0.7125 | 3.525 |
| 0.7131944444444445 | 3.525 |
| 0.7138888888888889 | 3.525 |
| 0.7145833333333332 | 7.887 |
| 0.7152777777777778 | 7.887 |
| 0.7159722222222222 | 12.257 |
| 0.7166666666666667 | 12.257 |
| 0.717361111111111 | 12.257 |
| 0.7180555555555556 | 16.636 |
| 0.71875 | 16.636 |
| 0.7194444444444444 | 16.636 |
| 0.720138888888889 | 21.024 |
| 0.7208333333333333 | 21.024 |
| 0.7215277777777778 | 25.419 |
| 0.7222222222222222 | 25.419 |
| 0.7229166666666668 | 29.823 |
| 0.7236111111111111 | 29.823 |
| 0.7243055555555555 | 29.823 |
| 0.725 | 25.419 |
| 0.7256944444444445 | 25.419 |
| 0.7263888888888889 | 21.024 |
| 0.7270833333333333 | 21.024 |
| 0.7277777777777777 | 16.636 |
| 0.7284722222222223 | 12.257 |
| 0.7291666666666666 | 12.257 |
| 0.7298611111111111 | 7.887 |
| 0.7305555555555556 | 3.525 |
| 0.7312500000000001 | 3.525 |
| 0.7319444444444444 | 3.525 |
| 0.7326388888888888 | 3.525 |
| 0.7333333333333334 | 0 |
| 0.7340277777777778 | 0 |
| 0.7347222222222222 | 0 |
| 0.7354166666666666 | 0 |
| 0.7361111111111112 | 0 |
| 0.7368055555555556 | 0 |
| 0.7374999999999999 | 0 |
| 0.7381944444444444 | 0 |
| 0.7388888888888889 | 0 |
| 0.7395833333333334 | 0 |
| 0.7402777777777777 | 0 |
| 0.7409722222222223 | 0 |
| 0.7416666666666667 | 0 |
| 0.7423611111111111 | 0 |
| 0.7430555555555555 | 0 |
| 0.74375 | 0 |
| 0.7444444444444445 | 0 |
| 0.7451388888888889 | 0 |
| 0.7458333333333332 | 0 |
| 0.7465277777777778 | 0 |
| 0.7472222222222222 | 0 |
| 0.7479166666666667 | 0 |
| 0.748611111111111 | 0 |
| 0.7493055555555556 | 0 |
| 0.75 | 0 |
| 0.7506944444444444 | 0 |
| 0.751388888888889 | 0 |
| 0.7520833333333333 | 0 |
| 0.7527777777777778 | 0 |
| 0.7534722222222222 | 0 |
| 0.7541666666666668 | 0 |
| 0.7548611111111111 | 0 |
| 0.7555555555555555 | 0 |
| 0.75625 | 0 |
| 0.7569444444444445 | 0 |
| 0.7576388888888889 | 0 |
| 0.7583333333333333 | 0 |
| 0.7590277777777777 | 0 |
| 0.7597222222222223 | 0 |
| 0.7604166666666666 | 0 |
| 0.7611111111111111 | 0 |
| 0.7618055555555556 | 0 |
| 0.7625000000000001 | 0 |
| 0.7631944444444444 | 0 |
| 0.7638888888888888 | 0 |
| 0.7645833333333334 | 0 |
| 0.7652777777777778 | 0 |
| 0.7659722222222222 | 0 |
| 0.7666666666666666 | 0 |
| 0.7673611111111112 | 0 |
| 0.7680555555555556 | 0 |
| 0.7687499999999999 | 0 |
| 0.7694444444444444 | 0 |
| 0.7701388888888889 | 0 |
| 0.7708333333333334 | 0 |
| 0.7715277777777777 | 0 |
| 0.7722222222222223 | 0 |
| 0.7729166666666667 | 0 |
| 0.7736111111111111 | 0 |
| 0.7743055555555555 | 0 |
| 0.775 | 0 |
| 0.7756944444444445 | 0 |
| 0.7763888888888889 | 0 |
| 0.7770833333333332 | 0 |
| 0.7777777777777778 | 0 |
| 0.7784722222222222 | 0 |
| 0.7791666666666667 | 0 |
| 0.779861111111111 | 0 |
| 0.7805555555555556 | 0 |
| 0.78125 | 0 |
| 0.7819444444444444 | 0 |
| 0.782638888888889 | 0 |
| 0.7833333333333333 | 0 |
| 0.7840277777777778 | 0 |
| 0.7847222222222222 | 0 |
| 0.7854166666666668 | 0 |
| 0.7861111111111111 | 0 |
| 0.7868055555555555 | 0 |
| 0.7875 | 0 |
| 0.7881944444444445 | 0 |
| 0.7888888888888889 | 0 |
| 0.7895833333333333 | 0 |
| 0.7902777777777777 | 0 |
| 0.7909722222222223 | 0 |
| 0.7916666666666666 | 0 |
| 0.7923611111111111 | 0 |
| 0.7930555555555556 | 0 |
| 0.7937500000000001 | 0 |
| 0.7944444444444444 | 0 |
| 0.7951388888888888 | 0 |
| 0.7958333333333334 | 0 |
| 0.7965277777777778 | 0 |
| 0.7972222222222222 | 0 |
| 0.7979166666666666 | 0 |
| 0.7986111111111112 | 0 |
| 0.7993055555555556 | 0 |
| 0.7999999999999999 | 0 |
| 0.8006944444444444 | 0 |
| 0.8013888888888889 | 0 |
| 0.8020833333333334 | 0 |
| 0.8027777777777777 | 0 |
| 0.8034722222222223 | 0 |
| 0.8041666666666667 | 0 |
| 0.8048611111111111 | 0 |
| 0.8055555555555555 | 0 |
| 0.80625 | 0 |
| 0.8069444444444445 | 0 |
| 0.8076388888888889 | 0 |
| 0.8083333333333332 | 0 |
| 0.8090277777777778 | 0 |
| 0.8097222222222222 | 0 |
| 0.8104166666666667 | 0 |
| 0.811111111111111 | 0 |
| 0.8118055555555556 | 0 |
| 0.8125 | 0 |
| 0.8131944444444444 | 0 |
| 0.813888888888889 | 0 |
| 0.8145833333333333 | 0 |
| 0.8152777777777778 | 0 |
| 0.8159722222222222 | 0 |
| 0.8166666666666668 | 0 |
| 0.8173611111111111 | 0 |
| 0.8180555555555555 | 0 |
| 0.81875 | 0 |
| 0.8194444444444445 | 0 |
| 0.8201388888888889 | 0 |
| 0.8208333333333333 | 0 |
| 0.8215277777777777 | 0 |
| 0.8222222222222223 | 0 |
| 0.8229166666666666 | 0 |
| 0.8236111111111111 | 0 |
| 0.8243055555555556 | 0 |
| 0.8250000000000001 | 0 |
| 0.8256944444444444 | 0 |
| 0.8263888888888888 | 0 |
| 0.8270833333333334 | 0 |
| 0.8277777777777778 | 0 |
| 0.8284722222222222 | 0 |
| 0.8291666666666666 | 0 |
| 0.8298611111111112 | 0 |
| 0.8305555555555556 | 0 |
| 0.8312499999999999 | 0 |
| 0.8319444444444444 | 0 |
| 0.8326388888888889 | 0 |
| 0.8333333333333334 | 0 |
| 0.8340277777777777 | 0 |
| 0.8347222222222223 | 0 |
| 0.8354166666666667 | 0 |
| 0.8361111111111111 | 0 |
| 0.8368055555555555 | 0 |
| 0.8375 | 0 |
| 0.8381944444444445 | 0 |
| 0.8388888888888889 | 0 |
| 0.8395833333333332 | 0 |
| 0.8402777777777778 | 0 |
| 0.8409722222222222 | 0 |
| 0.8416666666666667 | 0 |
| 0.842361111111111 | 0 |
| 0.8430555555555556 | 0 |
| 0.84375 | 0 |
| 0.8444444444444444 | 0 |
| 0.845138888888889 | 0 |
| 0.8458333333333333 | 0 |
| 0.8465277777777778 | 0 |
| 0.8472222222222222 | 0 |
| 0.8479166666666668 | 0 |
| 0.8486111111111111 | 0 |
| 0.8493055555555555 | 0 |
| 0.85 | 0 |
| 0.8506944444444445 | 0 |
| 0.8513888888888889 | 0 |
| 0.8520833333333333 | 0 |
| 0.8527777777777777 | 0 |
| 0.8534722222222223 | 0 |
| 0.8541666666666666 | 0 |
| 0.8548611111111111 | 0 |
| 0.8555555555555556 | 0 |
| 0.8562500000000001 | 0 |
| 0.8569444444444444 | 0 |
| 0.8576388888888888 | 0 |
| 0.8583333333333334 | 0 |
| 0.8590277777777778 | 0 |
| 0.8597222222222222 | 0 |
| 0.8604166666666666 | 0 |
| 0.8611111111111112 | 0 |
| 0.8618055555555556 | 0 |
| 0.8624999999999999 | 0 |
| 0.8631944444444444 | 0 |
| 0.8638888888888889 | 0 |
| 0.8645833333333334 | 0 |
| 0.8652777777777777 | 0 |
| 0.8659722222222223 | 0 |
| 0.8666666666666667 | 0 |
| 0.8673611111111111 | 0 |
| 0.8680555555555555 | 0 |
| 0.86875 | 0 |
| 0.8694444444444445 | 0 |
| 0.8701388888888889 | 0 |
| 0.8708333333333332 | 0 |
| 0.8715277777777778 | 0 |
| 0.8722222222222222 | 0 |
| 0.8729166666666667 | 0 |
| 0.873611111111111 | 0 |
| 0.8743055555555556 | 0 |
| 0.875 | 0 |
| 0.8756944444444444 | 0 |
| 0.876388888888889 | 0 |
| 0.8770833333333333 | 0 |
| 0.8777777777777778 | 0 |
| 0.8784722222222222 | 0 |
| 0.8791666666666668 | 0 |
| 0.8798611111111111 | 0 |
| 0.8805555555555555 | 0 |
| 0.88125 | 0 |
| 0.8819444444444445 | 0 |
| 0.8826388888888889 | 0 |
| 0.8833333333333333 | 0 |
| 0.8840277777777777 | 0 |
| 0.8847222222222223 | 0 |
| 0.8854166666666666 | 0 |
| 0.8861111111111111 | 0 |
| 0.8868055555555556 | 0 |
| 0.8875000000000001 | 0 |
| 0.8881944444444444 | 0 |
| 0.8888888888888888 | 0 |
| 0.8895833333333334 | 0 |
| 0.8902777777777778 | 0 |
| 0.8909722222222222 | 0 |
| 0.8916666666666666 | 0 |
| 0.8923611111111112 | 0 |
| 0.8930555555555556 | 0 |
| 0.8937499999999999 | 0 |
| 0.8944444444444444 | 0 |
| 0.8951388888888889 | 0 |
| 0.8958333333333334 | 0 |
| 0.8965277777777777 | 0 |
| 0.8972222222222223 | 0 |
| 0.8979166666666667 | 0 |
| 0.8986111111111111 | 0 |
| 0.8993055555555555 | 0 |
| 0.9 | 0 |
| 0.9006944444444445 | 0 |
| 0.9013888888888889 | 0 |
| 0.9020833333333332 | 0 |
| 0.9027777777777778 | 0 |
| 0.9034722222222222 | 0 |
| 0.9041666666666667 | 0 |
| 0.904861111111111 | 0 |
| 0.9055555555555556 | 0 |
| 0.90625 | 0 |
| 0.9069444444444444 | 0 |
| 0.907638888888889 | 0 |
| 0.9083333333333333 | 0 |
| 0.9090277777777778 | 0 |
| 0.9097222222222222 | 0 |
| 0.9104166666666668 | 0 |
| 0.9111111111111111 | 0 |
| 0.9118055555555555 | 0 |
| 0.9125 | 0 |
| 0.9131944444444445 | 0 |
| 0.9138888888888889 | 0 |
| 0.9145833333333333 | 0 |
| 0.9152777777777777 | 0 |
| 0.9159722222222223 | 0 |
| 0.9166666666666666 | 0 |
| 0.9173611111111111 | 0 |
| 0.9180555555555556 | 0 |
| 0.9187500000000001 | 0 |
| 0.9194444444444444 | 0 |
| 0.9201388888888888 | 0 |
| 0.9208333333333334 | 0 |
| 0.9215277777777778 | 0 |
| 0.9222222222222222 | 0 |
| 0.9229166666666666 | 0 |
| 0.9236111111111112 | 0 |
| 0.9243055555555556 | 0 |
| 0.9249999999999999 | 0 |
| 0.9256944444444444 | 0 |
| 0.9263888888888889 | 0 |
| 0.9270833333333334 | 0 |
| 0.9277777777777777 | 0 |
| 0.9284722222222223 | 0 |
| 0.9291666666666667 | 0 |
| 0.9298611111111111 | 0 |
| 0.9305555555555555 | 0 |
| 0.93125 | 0 |
| 0.9319444444444445 | 0 |
| 0.9326388888888889 | 0 |
| 0.9333333333333332 | 0 |
| 0.9340277777777778 | 0 |
| 0.9347222222222222 | 0 |
| 0.9354166666666667 | 0 |
| 0.936111111111111 | 0 |
| 0.9368055555555556 | 0 |
| 0.9375 | 0 |
| 0.9381944444444444 | 0 |
| 0.938888888888889 | 0 |
| 0.9395833333333333 | 0 |
| 0.9402777777777778 | 0 |
| 0.9409722222222222 | 0 |
| 0.9416666666666668 | 0 |
| 0.9423611111111111 | 0 |
| 0.9430555555555555 | 0 |
| 0.94375 | 0 |
| 0.9444444444444445 | 0 |
| 0.9451388888888889 | 0 |
| 0.9458333333333333 | 0 |
| 0.9465277777777777 | 0 |
| 0.9472222222222223 | 0 |
| 0.9479166666666666 | 0 |
| 0.9486111111111111 | 0 |
| 0.9493055555555556 | 0 |
| 0.9500000000000001 | 0 |
| 0.9506944444444444 | 0 |
| 0.9513888888888888 | 0 |
| 0.9520833333333334 | 0 |
| 0.9527777777777778 | 0 |
| 0.9534722222222222 | 0 |
| 0.9541666666666666 | 0 |
| 0.9548611111111112 | 0 |
| 0.9555555555555556 | 0 |
| 0.9562499999999999 | 0 |
| 0.9569444444444444 | 0 |
| 0.9576388888888889 | 0 |
| 0.9583333333333334 | 0 |
| 0.9590277777777777 | 0 |
| 0.9597222222222223 | 0 |
| 0.9604166666666667 | 0 |
| 0.9611111111111111 | 0 |
| 0.9618055555555555 | 0 |
| 0.9625 | 0 |
| 0.9631944444444445 | 0 |
| 0.9638888888888889 | 0 |
| 0.9645833333333332 | 0 |
| 0.9652777777777778 | 0 |
| 0.9659722222222222 | 0 |
| 0.9666666666666667 | 0 |
| 0.967361111111111 | 0 |
| 0.9680555555555556 | 0 |
| 0.96875 | 0 |
| 0.9694444444444444 | 0 |
| 0.970138888888889 | 0 |
| 0.9708333333333333 | 0 |
| 0.9715277777777778 | 0 |
| 0.9722222222222222 | 0 |
| 0.9729166666666668 | 0 |
| 0.9736111111111111 | 0 |
| 0.9743055555555555 | 0 |
| 0.975 | 0 |
| 0.9756944444444445 | 0 |
| 0.9763888888888889 | 0 |
| 0.9770833333333333 | 0 |
| 0.9777777777777777 | 0 |
| 0.9784722222222223 | 0 |
| 0.9791666666666666 | 0 |
| 0.9798611111111111 | 0 |
| 0.9805555555555556 | 0 |
| 0.9812500000000001 | 0 |
| 0.9819444444444444 | 0 |
| 0.9826388888888888 | 0 |
| 0.9833333333333334 | 0 |
| 0.9840277777777778 | 0 |
| 0.9847222222222222 | 0 |
| 0.9854166666666666 | 0 |
| 0.9861111111111112 | 0 |
| 0.9868055555555556 | 0 |
| 0.9874999999999999 | 0 |
| 0.9881944444444444 | 0 |
| 0.9888888888888889 | 0 |
| 0.9895833333333334 | 0 |
| 0.9902777777777777 | 0 |
| 0.9909722222222223 | 0 |
| 0.9916666666666667 | 0 |
| 0.9923611111111111 | 0 |
| 0.9930555555555555 | 0 |
| 0.99375 | 0 |
| 0.9944444444444445 | 0 |
| 0.9951388888888889 | 0 |
| 0.9958333333333332 | 0 |
| 0.9965277777777778 | 0 |
| 0.9972222222222222 | 0 |
| 0.9979166666666667 | 0 |
| 0.998611111111111 | 0 |
| 0.9993055555555556 | 0 |